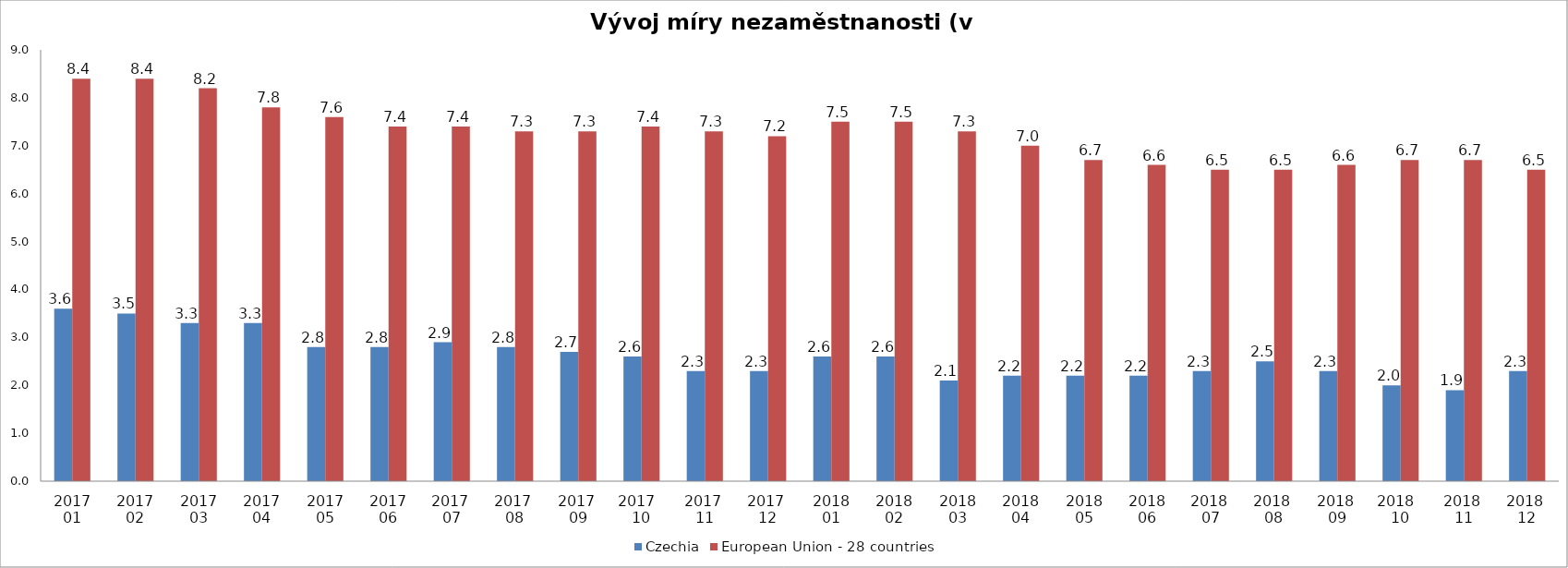
| Category | Czechia | European Union - 28 countries |
|---|---|---|
| 2017 01 | 3.6 | 8.4 |
| 2017 02 | 3.5 | 8.4 |
| 2017 03 | 3.3 | 8.2 |
| 2017 04 | 3.3 | 7.8 |
| 2017 05 | 2.8 | 7.6 |
| 2017 06 | 2.8 | 7.4 |
| 2017  07 | 2.9 | 7.4 |
| 2017  08 | 2.8 | 7.3 |
| 2017  09 | 2.7 | 7.3 |
| 2017   10 | 2.6 | 7.4 |
| 2017  11 | 2.3 | 7.3 |
| 2017  12 | 2.3 | 7.2 |
| 2018 01 | 2.6 | 7.5 |
| 2018 02 | 2.6 | 7.5 |
| 2018 03 | 2.1 | 7.3 |
| 2018 04 | 2.2 | 7 |
| 2018 05 | 2.2 | 6.7 |
| 2018 06 | 2.2 | 6.6 |
| 2018  07 | 2.3 | 6.5 |
| 2018  08 | 2.5 | 6.5 |
| 2018  09 | 2.3 | 6.6 |
| 2018   10 | 2 | 6.7 |
| 2018  11 | 1.9 | 6.7 |
| 2018  12 | 2.3 | 6.5 |